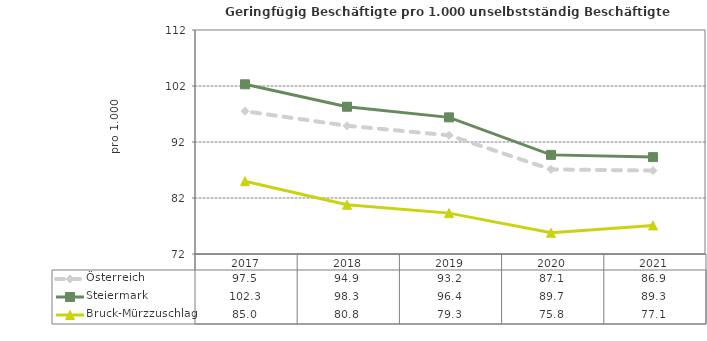
| Category | Österreich | Steiermark | Bruck-Mürzzuschlag |
|---|---|---|---|
| 2021.0 | 86.9 | 89.3 | 77.1 |
| 2020.0 | 87.1 | 89.7 | 75.8 |
| 2019.0 | 93.2 | 96.4 | 79.3 |
| 2018.0 | 94.9 | 98.3 | 80.8 |
| 2017.0 | 97.5 | 102.3 | 85 |